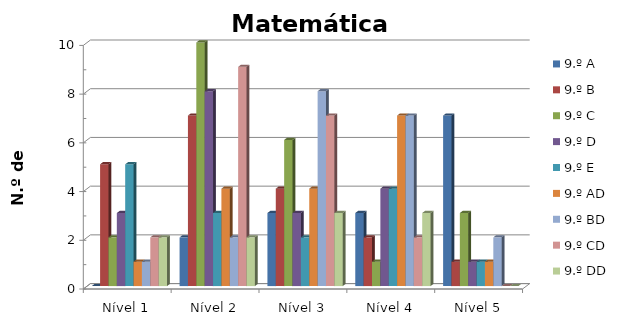
| Category | 9.º A | 9.º B | 9.º C | 9.º D | 9.º E | 9.º AD | 9.º BD | 9.º CD | 9.º DD |
|---|---|---|---|---|---|---|---|---|---|
| Nível 1 | 0 | 5 | 2 | 3 | 5 | 1 | 1 | 2 | 2 |
| Nível 2 | 2 | 7 | 10 | 8 | 3 | 4 | 2 | 9 | 2 |
| Nível 3 | 3 | 4 | 6 | 3 | 2 | 4 | 8 | 7 | 3 |
| Nível 4 | 3 | 2 | 1 | 4 | 4 | 7 | 7 | 2 | 3 |
| Nível 5 | 7 | 1 | 3 | 1 | 1 | 1 | 2 | 0 | 0 |